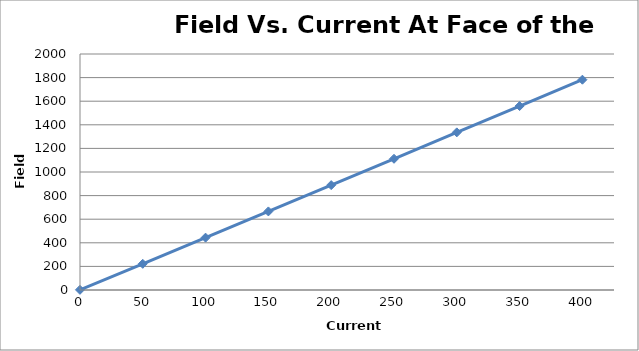
| Category | Series 0 |
|---|---|
| -0.0388 | 1.4 |
| 49.9658 | 221.9 |
| 99.9512 | 443.63 |
| 149.9362 | 666 |
| 199.9198 | 888.82 |
| 249.91 | 1112.15 |
| 299.89599999999996 | 1335.85 |
| 349.87 | 1559 |
| 399.858 | 1782.25 |